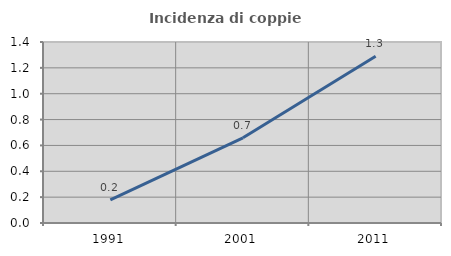
| Category | Incidenza di coppie miste |
|---|---|
| 1991.0 | 0.179 |
| 2001.0 | 0.659 |
| 2011.0 | 1.29 |